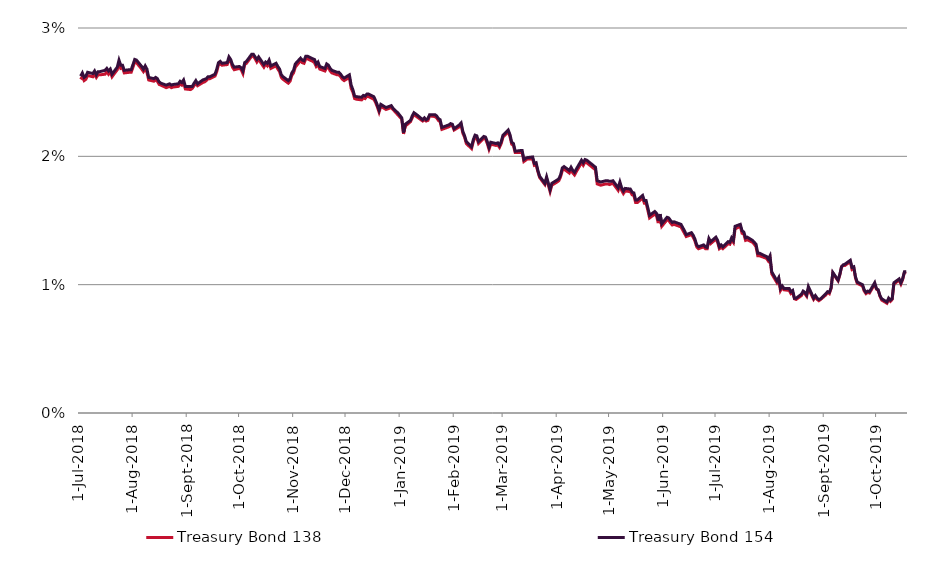
| Category | Treasury Bond 138 | Treasury Bond 154 |
|---|---|---|
| 2018-07-02 | 0.026 | 0.026 |
| 2018-07-03 | 0.026 | 0.026 |
| 2018-07-04 | 0.026 | 0.026 |
| 2018-07-05 | 0.026 | 0.026 |
| 2018-07-06 | 0.026 | 0.027 |
| 2018-07-09 | 0.026 | 0.026 |
| 2018-07-10 | 0.026 | 0.027 |
| 2018-07-11 | 0.026 | 0.026 |
| 2018-07-12 | 0.026 | 0.027 |
| 2018-07-13 | 0.026 | 0.027 |
| 2018-07-16 | 0.026 | 0.027 |
| 2018-07-17 | 0.027 | 0.027 |
| 2018-07-18 | 0.026 | 0.027 |
| 2018-07-19 | 0.027 | 0.027 |
| 2018-07-20 | 0.026 | 0.026 |
| 2018-07-23 | 0.027 | 0.027 |
| 2018-07-24 | 0.027 | 0.028 |
| 2018-07-25 | 0.027 | 0.027 |
| 2018-07-26 | 0.027 | 0.027 |
| 2018-07-27 | 0.026 | 0.027 |
| 2018-07-30 | 0.027 | 0.027 |
| 2018-07-31 | 0.027 | 0.027 |
| 2018-08-01 | 0.027 | 0.027 |
| 2018-08-02 | 0.027 | 0.028 |
| 2018-08-03 | 0.027 | 0.028 |
| 2018-08-06 | 0.027 | 0.027 |
| 2018-08-07 | 0.027 | 0.027 |
| 2018-08-08 | 0.027 | 0.027 |
| 2018-08-09 | 0.027 | 0.027 |
| 2018-08-10 | 0.026 | 0.026 |
| 2018-08-13 | 0.026 | 0.026 |
| 2018-08-14 | 0.026 | 0.026 |
| 2018-08-15 | 0.026 | 0.026 |
| 2018-08-16 | 0.026 | 0.026 |
| 2018-08-17 | 0.026 | 0.026 |
| 2018-08-20 | 0.025 | 0.026 |
| 2018-08-21 | 0.025 | 0.026 |
| 2018-08-22 | 0.025 | 0.026 |
| 2018-08-23 | 0.025 | 0.026 |
| 2018-08-24 | 0.025 | 0.026 |
| 2018-08-27 | 0.025 | 0.026 |
| 2018-08-28 | 0.026 | 0.026 |
| 2018-08-29 | 0.026 | 0.026 |
| 2018-08-30 | 0.026 | 0.026 |
| 2018-08-31 | 0.025 | 0.025 |
| 2018-09-03 | 0.025 | 0.025 |
| 2018-09-04 | 0.025 | 0.025 |
| 2018-09-05 | 0.026 | 0.026 |
| 2018-09-06 | 0.026 | 0.026 |
| 2018-09-07 | 0.026 | 0.026 |
| 2018-09-10 | 0.026 | 0.026 |
| 2018-09-11 | 0.026 | 0.026 |
| 2018-09-12 | 0.026 | 0.026 |
| 2018-09-13 | 0.026 | 0.026 |
| 2018-09-14 | 0.026 | 0.026 |
| 2018-09-17 | 0.026 | 0.026 |
| 2018-09-18 | 0.027 | 0.027 |
| 2018-09-19 | 0.027 | 0.027 |
| 2018-09-20 | 0.027 | 0.027 |
| 2018-09-21 | 0.027 | 0.027 |
| 2018-09-24 | 0.027 | 0.027 |
| 2018-09-25 | 0.028 | 0.028 |
| 2018-09-26 | 0.027 | 0.028 |
| 2018-09-27 | 0.027 | 0.027 |
| 2018-09-28 | 0.027 | 0.027 |
| 2018-10-01 | 0.027 | 0.027 |
| 2018-10-02 | 0.027 | 0.027 |
| 2018-10-03 | 0.026 | 0.027 |
| 2018-10-04 | 0.027 | 0.027 |
| 2018-10-05 | 0.027 | 0.027 |
| 2018-10-08 | 0.028 | 0.028 |
| 2018-10-09 | 0.028 | 0.028 |
| 2018-10-10 | 0.028 | 0.028 |
| 2018-10-11 | 0.027 | 0.028 |
| 2018-10-12 | 0.028 | 0.028 |
| 2018-10-15 | 0.027 | 0.027 |
| 2018-10-16 | 0.027 | 0.027 |
| 2018-10-17 | 0.027 | 0.027 |
| 2018-10-18 | 0.027 | 0.028 |
| 2018-10-19 | 0.027 | 0.027 |
| 2018-10-22 | 0.027 | 0.027 |
| 2018-10-23 | 0.027 | 0.027 |
| 2018-10-24 | 0.027 | 0.027 |
| 2018-10-25 | 0.026 | 0.026 |
| 2018-10-26 | 0.026 | 0.026 |
| 2018-10-29 | 0.026 | 0.026 |
| 2018-10-30 | 0.026 | 0.026 |
| 2018-10-31 | 0.026 | 0.026 |
| 2018-11-01 | 0.026 | 0.027 |
| 2018-11-02 | 0.027 | 0.027 |
| 2018-11-05 | 0.027 | 0.028 |
| 2018-11-06 | 0.027 | 0.028 |
| 2018-11-07 | 0.027 | 0.027 |
| 2018-11-08 | 0.028 | 0.028 |
| 2018-11-09 | 0.028 | 0.028 |
| 2018-11-12 | 0.027 | 0.028 |
| 2018-11-13 | 0.027 | 0.028 |
| 2018-11-14 | 0.027 | 0.027 |
| 2018-11-15 | 0.027 | 0.027 |
| 2018-11-16 | 0.027 | 0.027 |
| 2018-11-19 | 0.027 | 0.027 |
| 2018-11-20 | 0.027 | 0.027 |
| 2018-11-21 | 0.027 | 0.027 |
| 2018-11-22 | 0.027 | 0.027 |
| 2018-11-23 | 0.026 | 0.027 |
| 2018-11-26 | 0.026 | 0.027 |
| 2018-11-27 | 0.026 | 0.027 |
| 2018-11-28 | 0.026 | 0.026 |
| 2018-11-29 | 0.026 | 0.026 |
| 2018-11-30 | 0.026 | 0.026 |
| 2018-12-03 | 0.026 | 0.026 |
| 2018-12-04 | 0.025 | 0.026 |
| 2018-12-05 | 0.025 | 0.025 |
| 2018-12-06 | 0.024 | 0.025 |
| 2018-12-07 | 0.024 | 0.025 |
| 2018-12-10 | 0.024 | 0.025 |
| 2018-12-11 | 0.025 | 0.025 |
| 2018-12-12 | 0.024 | 0.025 |
| 2018-12-13 | 0.025 | 0.025 |
| 2018-12-14 | 0.025 | 0.025 |
| 2018-12-17 | 0.024 | 0.025 |
| 2018-12-18 | 0.024 | 0.024 |
| 2018-12-19 | 0.024 | 0.024 |
| 2018-12-20 | 0.023 | 0.024 |
| 2018-12-21 | 0.024 | 0.024 |
| 2018-12-24 | 0.024 | 0.024 |
| 2018-12-27 | 0.024 | 0.024 |
| 2018-12-28 | 0.024 | 0.024 |
| 2018-12-31 | 0.023 | 0.023 |
| 2019-01-02 | 0.023 | 0.023 |
| 2019-01-03 | 0.022 | 0.022 |
| 2019-01-04 | 0.022 | 0.022 |
| 2019-01-07 | 0.023 | 0.023 |
| 2019-01-08 | 0.023 | 0.023 |
| 2019-01-09 | 0.023 | 0.023 |
| 2019-01-10 | 0.023 | 0.023 |
| 2019-01-11 | 0.023 | 0.023 |
| 2019-01-14 | 0.023 | 0.023 |
| 2019-01-15 | 0.023 | 0.023 |
| 2019-01-16 | 0.023 | 0.023 |
| 2019-01-17 | 0.023 | 0.023 |
| 2019-01-18 | 0.023 | 0.023 |
| 2019-01-21 | 0.023 | 0.023 |
| 2019-01-22 | 0.023 | 0.023 |
| 2019-01-23 | 0.023 | 0.023 |
| 2019-01-24 | 0.023 | 0.023 |
| 2019-01-25 | 0.022 | 0.022 |
| 2019-01-29 | 0.022 | 0.022 |
| 2019-01-30 | 0.022 | 0.023 |
| 2019-01-31 | 0.022 | 0.022 |
| 2019-02-01 | 0.022 | 0.022 |
| 2019-02-04 | 0.022 | 0.022 |
| 2019-02-05 | 0.022 | 0.023 |
| 2019-02-06 | 0.022 | 0.022 |
| 2019-02-07 | 0.022 | 0.022 |
| 2019-02-08 | 0.021 | 0.021 |
| 2019-02-11 | 0.021 | 0.021 |
| 2019-02-12 | 0.021 | 0.021 |
| 2019-02-13 | 0.022 | 0.022 |
| 2019-02-14 | 0.021 | 0.022 |
| 2019-02-15 | 0.021 | 0.021 |
| 2019-02-18 | 0.021 | 0.022 |
| 2019-02-19 | 0.021 | 0.022 |
| 2019-02-20 | 0.021 | 0.021 |
| 2019-02-21 | 0.021 | 0.021 |
| 2019-02-22 | 0.021 | 0.021 |
| 2019-02-25 | 0.021 | 0.021 |
| 2019-02-26 | 0.021 | 0.021 |
| 2019-02-27 | 0.021 | 0.021 |
| 2019-02-28 | 0.021 | 0.021 |
| 2019-03-01 | 0.022 | 0.022 |
| 2019-03-04 | 0.022 | 0.022 |
| 2019-03-05 | 0.022 | 0.022 |
| 2019-03-06 | 0.021 | 0.021 |
| 2019-03-07 | 0.021 | 0.021 |
| 2019-03-08 | 0.02 | 0.02 |
| 2019-03-11 | 0.02 | 0.02 |
| 2019-03-12 | 0.02 | 0.02 |
| 2019-03-13 | 0.02 | 0.02 |
| 2019-03-14 | 0.02 | 0.02 |
| 2019-03-15 | 0.02 | 0.02 |
| 2019-03-18 | 0.02 | 0.02 |
| 2019-03-19 | 0.019 | 0.019 |
| 2019-03-20 | 0.019 | 0.02 |
| 2019-03-21 | 0.019 | 0.019 |
| 2019-03-22 | 0.018 | 0.018 |
| 2019-03-25 | 0.018 | 0.018 |
| 2019-03-26 | 0.018 | 0.018 |
| 2019-03-27 | 0.018 | 0.018 |
| 2019-03-28 | 0.017 | 0.017 |
| 2019-03-29 | 0.018 | 0.018 |
| 2019-04-01 | 0.018 | 0.018 |
| 2019-04-02 | 0.018 | 0.018 |
| 2019-04-03 | 0.018 | 0.019 |
| 2019-04-04 | 0.019 | 0.019 |
| 2019-04-05 | 0.019 | 0.019 |
| 2019-04-08 | 0.019 | 0.019 |
| 2019-04-09 | 0.019 | 0.019 |
| 2019-04-10 | 0.019 | 0.019 |
| 2019-04-11 | 0.019 | 0.019 |
| 2019-04-12 | 0.019 | 0.019 |
| 2019-04-15 | 0.02 | 0.02 |
| 2019-04-16 | 0.019 | 0.02 |
| 2019-04-17 | 0.02 | 0.02 |
| 2019-04-18 | 0.02 | 0.02 |
| 2019-04-23 | 0.019 | 0.019 |
| 2019-04-24 | 0.018 | 0.018 |
| 2019-04-26 | 0.018 | 0.018 |
| 2019-04-29 | 0.018 | 0.018 |
| 2019-04-30 | 0.018 | 0.018 |
| 2019-05-01 | 0.018 | 0.018 |
| 2019-05-02 | 0.018 | 0.018 |
| 2019-05-03 | 0.018 | 0.018 |
| 2019-05-06 | 0.017 | 0.018 |
| 2019-05-07 | 0.018 | 0.018 |
| 2019-05-08 | 0.017 | 0.018 |
| 2019-05-09 | 0.017 | 0.017 |
| 2019-05-10 | 0.017 | 0.018 |
| 2019-05-13 | 0.017 | 0.017 |
| 2019-05-14 | 0.017 | 0.017 |
| 2019-05-15 | 0.017 | 0.017 |
| 2019-05-16 | 0.016 | 0.017 |
| 2019-05-17 | 0.016 | 0.017 |
| 2019-05-20 | 0.017 | 0.017 |
| 2019-05-21 | 0.016 | 0.017 |
| 2019-05-22 | 0.016 | 0.017 |
| 2019-05-23 | 0.016 | 0.016 |
| 2019-05-24 | 0.015 | 0.015 |
| 2019-05-27 | 0.016 | 0.016 |
| 2019-05-28 | 0.015 | 0.016 |
| 2019-05-29 | 0.015 | 0.015 |
| 2019-05-30 | 0.015 | 0.016 |
| 2019-05-31 | 0.015 | 0.015 |
| 2019-06-03 | 0.015 | 0.015 |
| 2019-06-04 | 0.015 | 0.015 |
| 2019-06-05 | 0.015 | 0.015 |
| 2019-06-06 | 0.015 | 0.015 |
| 2019-06-07 | 0.015 | 0.015 |
| 2019-06-11 | 0.014 | 0.015 |
| 2019-06-12 | 0.014 | 0.014 |
| 2019-06-13 | 0.014 | 0.014 |
| 2019-06-14 | 0.014 | 0.014 |
| 2019-06-17 | 0.014 | 0.014 |
| 2019-06-18 | 0.014 | 0.014 |
| 2019-06-19 | 0.013 | 0.014 |
| 2019-06-20 | 0.013 | 0.013 |
| 2019-06-21 | 0.013 | 0.013 |
| 2019-06-24 | 0.013 | 0.013 |
| 2019-06-25 | 0.013 | 0.013 |
| 2019-06-26 | 0.013 | 0.013 |
| 2019-06-27 | 0.013 | 0.014 |
| 2019-06-28 | 0.013 | 0.013 |
| 2019-07-01 | 0.014 | 0.014 |
| 2019-07-02 | 0.013 | 0.013 |
| 2019-07-03 | 0.013 | 0.013 |
| 2019-07-04 | 0.013 | 0.013 |
| 2019-07-05 | 0.013 | 0.013 |
| 2019-07-08 | 0.013 | 0.013 |
| 2019-07-09 | 0.013 | 0.013 |
| 2019-07-10 | 0.014 | 0.014 |
| 2019-07-11 | 0.013 | 0.013 |
| 2019-07-12 | 0.014 | 0.015 |
| 2019-07-15 | 0.015 | 0.015 |
| 2019-07-16 | 0.014 | 0.014 |
| 2019-07-17 | 0.014 | 0.014 |
| 2019-07-18 | 0.013 | 0.014 |
| 2019-07-19 | 0.014 | 0.014 |
| 2019-07-22 | 0.013 | 0.013 |
| 2019-07-23 | 0.013 | 0.013 |
| 2019-07-24 | 0.013 | 0.013 |
| 2019-07-25 | 0.012 | 0.012 |
| 2019-07-26 | 0.012 | 0.012 |
| 2019-07-29 | 0.012 | 0.012 |
| 2019-07-30 | 0.012 | 0.012 |
| 2019-07-31 | 0.012 | 0.012 |
| 2019-08-01 | 0.012 | 0.012 |
| 2019-08-02 | 0.011 | 0.011 |
| 2019-08-05 | 0.01 | 0.01 |
| 2019-08-06 | 0.01 | 0.011 |
| 2019-08-07 | 0.01 | 0.01 |
| 2019-08-08 | 0.01 | 0.01 |
| 2019-08-09 | 0.01 | 0.01 |
| 2019-08-12 | 0.01 | 0.01 |
| 2019-08-13 | 0.009 | 0.009 |
| 2019-08-14 | 0.009 | 0.01 |
| 2019-08-15 | 0.009 | 0.009 |
| 2019-08-16 | 0.009 | 0.009 |
| 2019-08-19 | 0.009 | 0.009 |
| 2019-08-20 | 0.009 | 0.01 |
| 2019-08-21 | 0.009 | 0.009 |
| 2019-08-22 | 0.009 | 0.009 |
| 2019-08-23 | 0.01 | 0.01 |
| 2019-08-26 | 0.009 | 0.009 |
| 2019-08-27 | 0.009 | 0.009 |
| 2019-08-28 | 0.009 | 0.009 |
| 2019-08-29 | 0.009 | 0.009 |
| 2019-08-30 | 0.009 | 0.009 |
| 2019-09-02 | 0.009 | 0.009 |
| 2019-09-03 | 0.009 | 0.009 |
| 2019-09-04 | 0.009 | 0.009 |
| 2019-09-05 | 0.01 | 0.01 |
| 2019-09-06 | 0.011 | 0.011 |
| 2019-09-09 | 0.01 | 0.01 |
| 2019-09-10 | 0.011 | 0.011 |
| 2019-09-11 | 0.011 | 0.011 |
| 2019-09-12 | 0.012 | 0.012 |
| 2019-09-13 | 0.012 | 0.012 |
| 2019-09-16 | 0.012 | 0.012 |
| 2019-09-17 | 0.011 | 0.011 |
| 2019-09-18 | 0.011 | 0.011 |
| 2019-09-19 | 0.01 | 0.011 |
| 2019-09-20 | 0.01 | 0.01 |
| 2019-09-23 | 0.01 | 0.01 |
| 2019-09-24 | 0.01 | 0.01 |
| 2019-09-25 | 0.009 | 0.009 |
| 2019-09-26 | 0.009 | 0.01 |
| 2019-09-27 | 0.009 | 0.009 |
| 2019-09-30 | 0.01 | 0.01 |
| 2019-10-01 | 0.01 | 0.01 |
| 2019-10-02 | 0.01 | 0.01 |
| 2019-10-03 | 0.009 | 0.009 |
| 2019-10-04 | 0.009 | 0.009 |
| 2019-10-07 | 0.009 | 0.009 |
| 2019-10-08 | 0.009 | 0.009 |
| 2019-10-09 | 0.009 | 0.009 |
| 2019-10-10 | 0.009 | 0.009 |
| 2019-10-11 | 0.01 | 0.01 |
| 2019-10-14 | 0.01 | 0.01 |
| 2019-10-15 | 0.01 | 0.01 |
| 2019-10-16 | 0.01 | 0.01 |
| 2019-10-17 | 0.011 | 0.011 |
| 2019-10-18 | 0.011 | 0.011 |